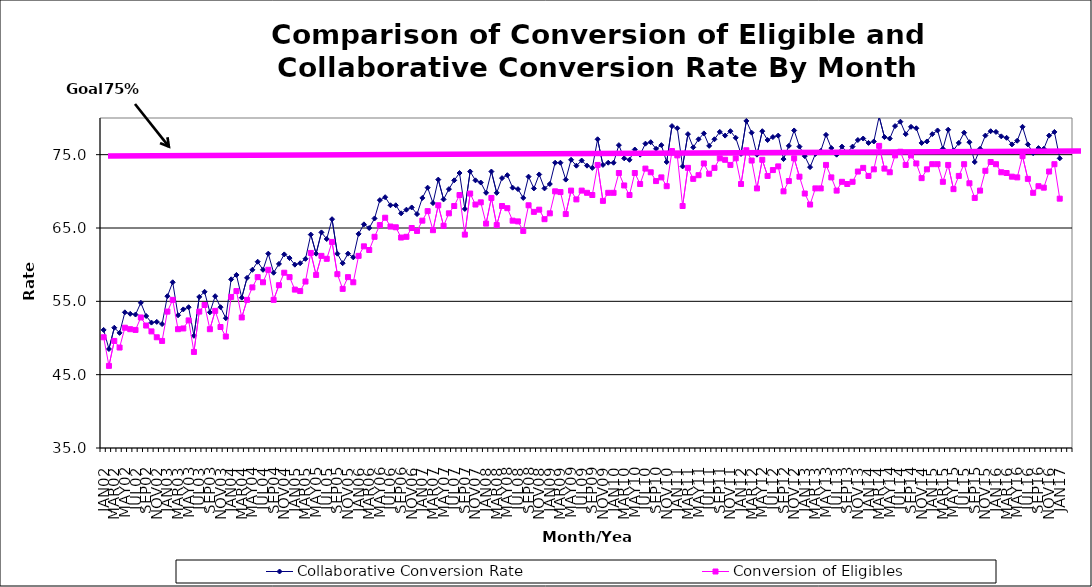
| Category | Collaborative Conversion Rate | Conversion of Eligibles |
|---|---|---|
| JAN02 | 51.1 | 50.1 |
| FEB02 | 48.5 | 46.2 |
| MAR02 | 51.4 | 49.6 |
| APR02 | 50.7 | 48.7 |
| MAY02 | 53.5 | 51.4 |
| JUN02 | 53.3 | 51.2 |
| JUL02 | 53.2 | 51.1 |
| AUG02 | 54.8 | 52.8 |
| SEP02 | 53 | 51.7 |
| OCT02 | 52.1 | 50.9 |
| NOV02 | 52.2 | 50.1 |
| DEC02 | 51.9 | 49.6 |
| JAN03 | 55.7 | 53.6 |
| FEB03 | 57.6 | 55.2 |
| MAR03 | 53.1 | 51.2 |
| APR03 | 53.9 | 51.3 |
| MAY03 | 54.2 | 52.4 |
| JUN03 | 50.3 | 48.1 |
| JUL03 | 55.6 | 53.6 |
| AUG03 | 56.3 | 54.5 |
| SEP03 | 53.5 | 51.2 |
| OCT03 | 55.7 | 53.7 |
| NOV03 | 54.2 | 51.5 |
| DEC03 | 52.7 | 50.2 |
| JAN04 | 58 | 55.6 |
| FEB04 | 58.6 | 56.4 |
| MAR04 | 55.5 | 52.8 |
| APR04 | 58.2 | 55.2 |
| MAY04 | 59.3 | 56.9 |
| JUN04 | 60.4 | 58.3 |
| JUL04 | 59.3 | 57.6 |
| AUG04 | 61.5 | 59.3 |
| SEP04 | 58.9 | 55.2 |
| OCT04 | 60.1 | 57.2 |
| NOV04 | 61.4 | 58.9 |
| DEC04 | 60.9 | 58.3 |
| JAN05 | 60 | 56.6 |
| FEB05 | 60.2 | 56.4 |
| MAR05 | 60.8 | 57.7 |
| APR05 | 64.1 | 61.6 |
| MAY05 | 61.5 | 58.6 |
| JUN05 | 64.4 | 61.2 |
| JUL05 | 63.5 | 60.8 |
| AUG05 | 66.2 | 63.1 |
| SEP05 | 61.5 | 58.7 |
| OCT05 | 60.2 | 56.7 |
| NOV05 | 61.5 | 58.3 |
| DEC05 | 61 | 57.6 |
| JAN06 | 64.2 | 61.2 |
| FEB06 | 65.5 | 62.5 |
| MAR06 | 65 | 62 |
| APR06 | 66.3 | 63.8 |
| MAY06 | 68.8 | 65.4 |
| JUN06 | 69.2 | 66.4 |
| JUL06 | 68.1 | 65.2 |
| AUG06 | 68.1 | 65.1 |
| SEP06 | 67 | 63.7 |
| OCT06 | 67.5 | 63.8 |
| NOV06 | 67.8 | 65 |
| DEC06 | 66.9 | 64.6 |
| JAN07 | 69.1 | 66 |
| FEB07 | 70.5 | 67.3 |
| MAR07 | 68.4 | 64.7 |
| APR07 | 71.6 | 68.1 |
| MAY07 | 68.9 | 65.3 |
| JUN07 | 70.3 | 67 |
| JUL07 | 71.5 | 68 |
| AUG07 | 72.5 | 69.5 |
| SEP07 | 67.6 | 64.1 |
| OCT07 | 72.7 | 69.7 |
| NOV07 | 71.5 | 68.2 |
| DEC07 | 71.2 | 68.5 |
| JAN08 | 69.8 | 65.6 |
| FEB08 | 72.7 | 69.1 |
| MAR08 | 69.8 | 65.4 |
| APR08 | 71.8 | 68 |
| MAY08 | 72.2 | 67.7 |
| JUN08 | 70.5 | 66 |
| JUL08 | 70.3 | 65.9 |
| AUG08 | 69.1 | 64.6 |
| SEP08 | 72 | 68.1 |
| OCT08 | 70.4 | 67.2 |
| NOV08 | 72.3 | 67.5 |
| DEC08 | 70.4 | 66.2 |
| JAN09 | 71 | 67 |
| FEB09 | 73.9 | 70 |
| MAR09 | 73.9 | 69.9 |
| APR09 | 71.6 | 66.9 |
| MAY09 | 74.3 | 70.1 |
| JUN09 | 73.5 | 68.9 |
| JUL09 | 74.2 | 70.1 |
| AUG09 | 73.5 | 69.8 |
| SEP09 | 73.2 | 69.5 |
| OCT09 | 77.1 | 73.6 |
| NOV09 | 73.6 | 68.7 |
| DEC09 | 73.9 | 69.8 |
| JAN10 | 73.9 | 69.8 |
| FEB10 | 76.3 | 72.5 |
| MAR10 | 74.5 | 70.8 |
| APR10 | 74.3 | 69.5 |
| MAY10 | 75.7 | 72.5 |
| JUN10 | 75 | 71 |
| JUL10 | 76.5 | 73.1 |
| AUG10 | 76.7 | 72.6 |
| SEP10 | 75.8 | 71.4 |
| OCT10 | 76.3 | 71.9 |
| NOV10 | 74 | 70.7 |
| DEC10 | 78.9 | 75.5 |
| JAN11 | 78.6 | 74.9 |
| FEB11 | 73.4 | 68 |
| MAR11 | 77.8 | 73.2 |
| APR11 | 76 | 71.7 |
| MAY11 | 77.1 | 72.2 |
| JUN11 | 77.9 | 73.8 |
| JUL11 | 76.2 | 72.4 |
| AUG11 | 77.1 | 73.2 |
| SEP11 | 78.1 | 74.5 |
| OCT11 | 77.6 | 74.3 |
| NOV11 | 78.2 | 73.6 |
| DEC11 | 77.3 | 74.5 |
| JAN12 | 75.1 | 71 |
| FEB12 | 79.6 | 75.6 |
| MAR12 | 78 | 74.2 |
| APR12 | 75 | 70.4 |
| MAY12 | 78.2 | 74.3 |
| JUN12 | 77 | 72.1 |
| JUL12 | 77.4 | 72.9 |
| AUG12 | 77.6 | 73.4 |
| SEP12 | 74.4 | 70 |
| OCT12 | 76.2 | 71.4 |
| NOV12 | 78.3 | 74.5 |
| DEC12 | 76.1 | 72 |
| JAN13 | 74.8 | 69.7 |
| FEB13 | 73.3 | 68.2 |
| MAR13 | 75.1 | 70.4 |
| APR13 | 75.5 | 70.4 |
| MAY13 | 77.7 | 73.6 |
| JUN13 | 75.9 | 71.9 |
| JUL13 | 75 | 70.1 |
| AUG13 | 76.1 | 71.3 |
| SEP13 | 75.3 | 71 |
| OCT13 | 76.1 | 71.3 |
| NOV13 | 77 | 72.7 |
| DEC13 | 77.2 | 73.2 |
| JAN14 | 76.6 | 72.1 |
| FEB14 | 76.8 | 73 |
| MAR14 | 80.2 | 76.2 |
| APR14 | 77.4 | 73.1 |
| MAY14 | 77.2 | 72.6 |
| JUN14 | 78.9 | 74.9 |
| JUL14 | 79.5 | 75.4 |
| AUG14 | 77.8 | 73.6 |
| SEP14 | 78.8 | 74.9 |
| OCT14 | 78.6 | 73.8 |
| NOV14 | 76.6 | 71.8 |
| DEC14 | 76.8 | 73 |
| JAN15 | 77.8 | 73.7 |
| FEB15 | 78.3 | 73.7 |
| MAR15 | 75.8 | 71.3 |
| APR15 | 78.4 | 73.6 |
| MAY15 | 75.6 | 70.3 |
| JUN15 | 76.6 | 72.1 |
| JUL15 | 78 | 73.7 |
| AUG15 | 76.7 | 71.1 |
| SEP15 | 74 | 69.1 |
| OCT15 | 75.8 | 70.1 |
| NOV15 | 77.6 | 72.8 |
| DEC15 | 78.2 | 74 |
| JAN16 | 78.1 | 73.7 |
| FEB16 | 77.5 | 72.6 |
| MAR16 | 77.3 | 72.5 |
| APR16 | 76.4 | 72 |
| MAY16 | 76.9 | 71.9 |
| JUN16 | 78.8 | 74.8 |
| JUL16 | 76.4 | 71.7 |
| AUG16 | 75.2 | 69.8 |
| SEP16 | 75.9 | 70.7 |
| OCT16 | 75.8 | 70.5 |
| NOV16 | 77.6 | 72.7 |
| DEC16 | 78.1 | 73.7 |
| JAN17 | 74.5 | 69 |